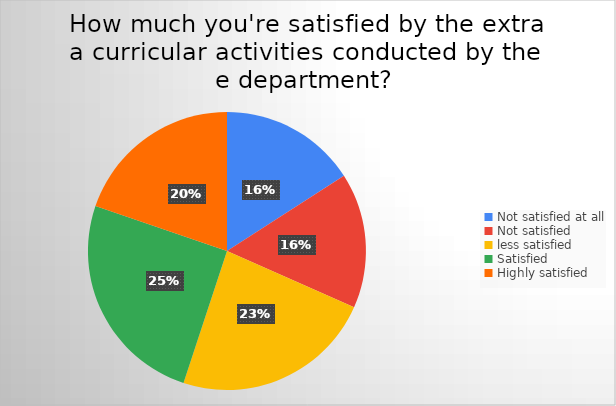
| Category | Series 0 |
|---|---|
| Not satisfied at all | 91 |
| Not satisfied  | 90 |
| less satisfied | 134 |
| Satisfied | 144 |
| Highly satisfied | 113 |